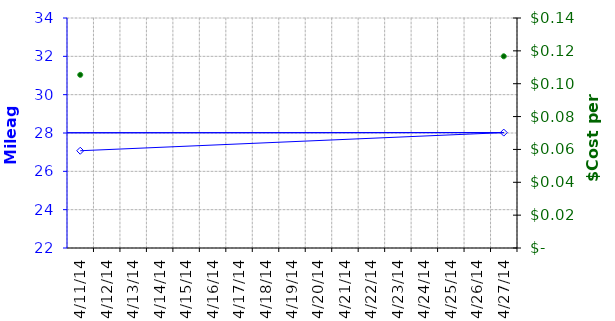
| Category | MPG |
|---|---|
| 4/11/14 | 27.075 |
| 4/27/14 | 28.021 |
| nan | 0 |
| nan | 0 |
| nan | 0 |
| nan | 0 |
| nan | 0 |
| nan | 0 |
| nan | 0 |
| nan | 0 |
| nan | 0 |
| nan | 0 |
| nan | 0 |
| nan | 0 |
| nan | 0 |
| nan | 0 |
| nan | 0 |
| nan | 0 |
| nan | 0 |
| nan | 0 |
| nan | 0 |
| nan | 0 |
| nan | 0 |
| nan | 0 |
| nan | 0 |
| nan | 0 |
| nan | 0 |
| nan | 0 |
| nan | 0 |
| nan | 0 |
| nan | 0 |
| nan | 0 |
| nan | 0 |
| nan | 0 |
| nan | 0 |
| nan | 0 |
| nan | 0 |
| nan | 0 |
| nan | 0 |
| nan | 0 |
| nan | 0 |
| nan | 0 |